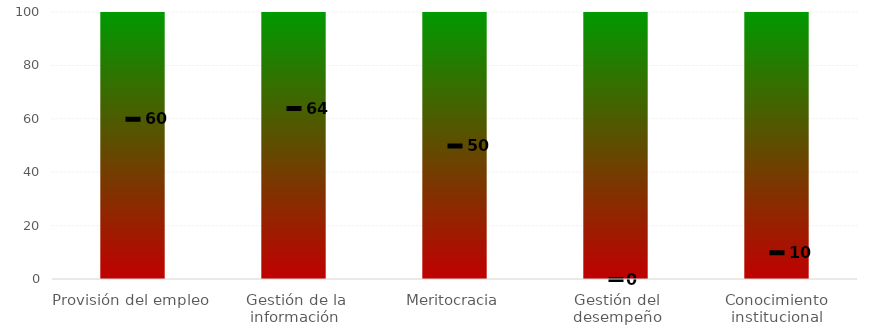
| Category | Niveles |
|---|---|
| Provisión del empleo | 100 |
| Gestión de la información | 100 |
| Meritocracia | 100 |
| Gestión del desempeño | 100 |
| Conocimiento institucional | 100 |